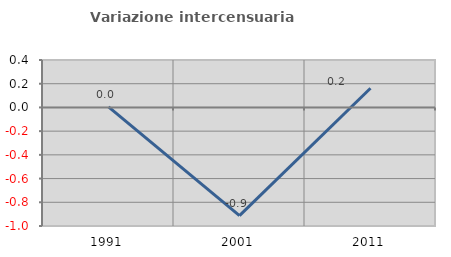
| Category | Variazione intercensuaria annua |
|---|---|
| 1991.0 | 0.004 |
| 2001.0 | -0.913 |
| 2011.0 | 0.162 |